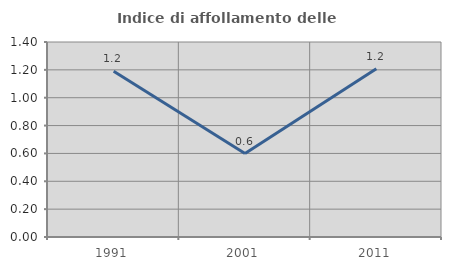
| Category | Indice di affollamento delle abitazioni  |
|---|---|
| 1991.0 | 1.19 |
| 2001.0 | 0.599 |
| 2011.0 | 1.208 |